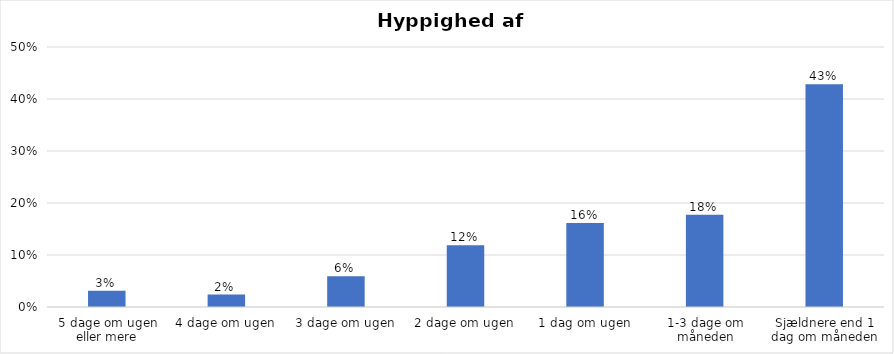
| Category | % |
|---|---|
| 5 dage om ugen eller mere | 0.031 |
| 4 dage om ugen | 0.024 |
| 3 dage om ugen | 0.059 |
| 2 dage om ugen | 0.119 |
| 1 dag om ugen | 0.161 |
| 1-3 dage om måneden | 0.177 |
| Sjældnere end 1 dag om måneden | 0.428 |